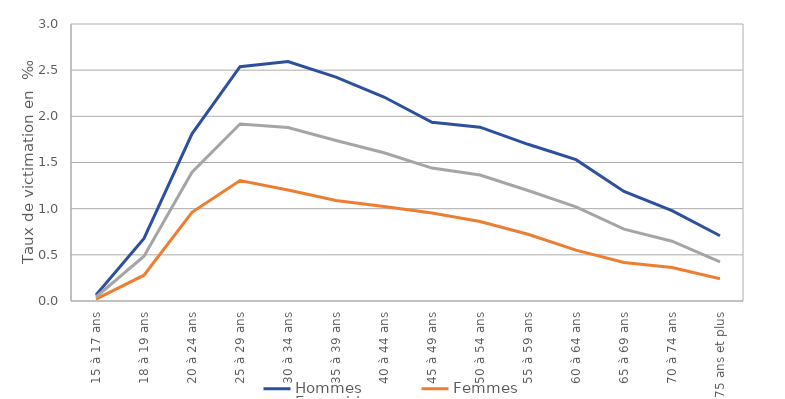
| Category | Hommes | Femmes | Ensemble |
|---|---|---|---|
| 15 à 17 ans | 0.066 | 0.02 | 0.043 |
| 18 à 19 ans | 0.678 | 0.279 | 0.485 |
| 20 à 24 ans | 1.811 | 0.961 | 1.394 |
| 25 à 29 ans | 2.537 | 1.304 | 1.916 |
| 30 à 34 ans | 2.592 | 1.203 | 1.88 |
| 35 à 39 ans | 2.425 | 1.089 | 1.738 |
| 40 à 44 ans | 2.209 | 1.024 | 1.605 |
| 45 à 49 ans | 1.936 | 0.953 | 1.439 |
| 50 à 54 ans | 1.882 | 0.862 | 1.364 |
| 55 à 59 ans | 1.697 | 0.723 | 1.197 |
| 60 à 64 ans | 1.531 | 0.551 | 1.019 |
| 65 à 69 ans | 1.187 | 0.417 | 0.778 |
| 70 à 74 ans | 0.979 | 0.363 | 0.648 |
| 75 ans et plus | 0.707 | 0.241 | 0.423 |